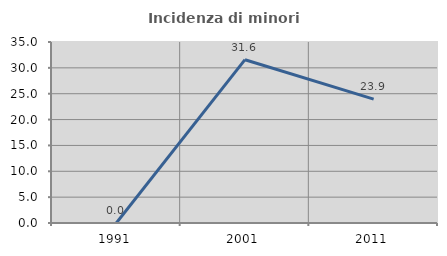
| Category | Incidenza di minori stranieri |
|---|---|
| 1991.0 | 0 |
| 2001.0 | 31.579 |
| 2011.0 | 23.944 |